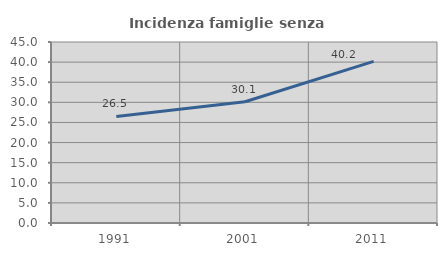
| Category | Incidenza famiglie senza nuclei |
|---|---|
| 1991.0 | 26.496 |
| 2001.0 | 30.144 |
| 2011.0 | 40.183 |